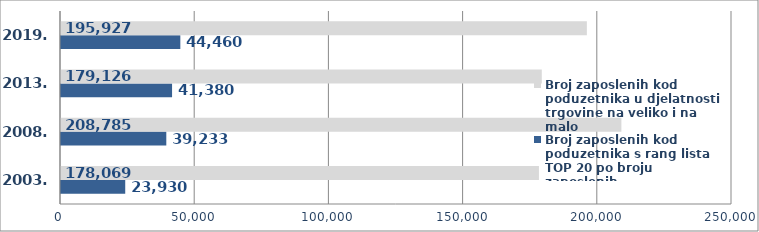
| Category | Broj zaposlenih kod poduzetnika s rang lista TOP 20 po broju zaposlenih  | Broj zaposlenih kod poduzetnika u djelatnosti trgovine na veliko i na malo |
|---|---|---|
| 2003. | 23930 | 178069 |
| 2008. | 39233 | 208785 |
| 2013. | 41380 | 179126 |
| 2019. | 44460 | 195927 |